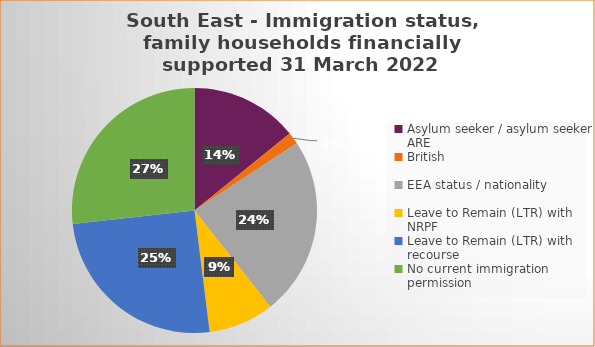
| Category | Number  | Percentage |
|---|---|---|
| Asylum seeker / asylum seeker ARE | 18 | 0.142 |
| British | 2 | 0.016 |
| EEA status / nationality  | 30 | 0.236 |
| Leave to Remain (LTR) with NRPF | 11 | 0.087 |
| Leave to Remain (LTR) with recourse | 32 | 0.252 |
| No current immigration permission | 34 | 0.268 |